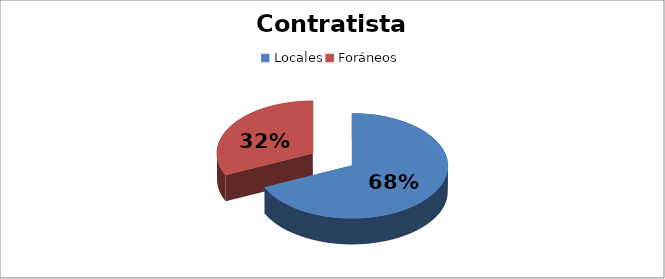
| Category | Suma |
|---|---|
| Locales | 5280743.92 |
| Foráneos | 2465021.06 |